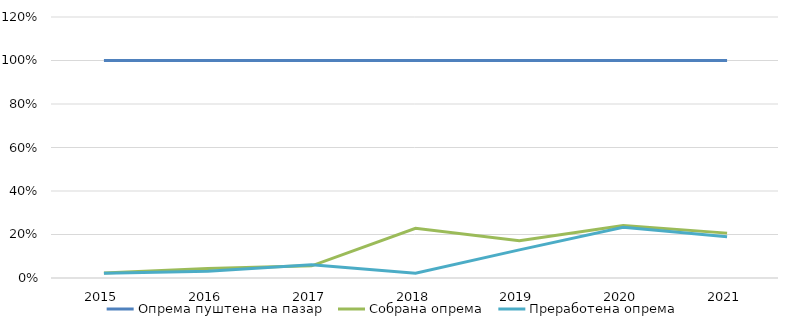
| Category | Опрема пуштена на пазар  | Собрана опрема  | Преработена опрема  |
|---|---|---|---|
| 2015.0 | 1 | 0.023 | 0.021 |
| 2016.0 | 1 | 0.043 | 0.031 |
| 2017.0 | 1 | 0.056 | 0.06 |
| 2018.0 | 1 | 0.228 | 0.022 |
| 2019.0 | 1 | 0.171 | 0.129 |
| 2020.0 | 1 | 0.241 | 0.233 |
| 2021.0 | 1 | 0.206 | 0.19 |